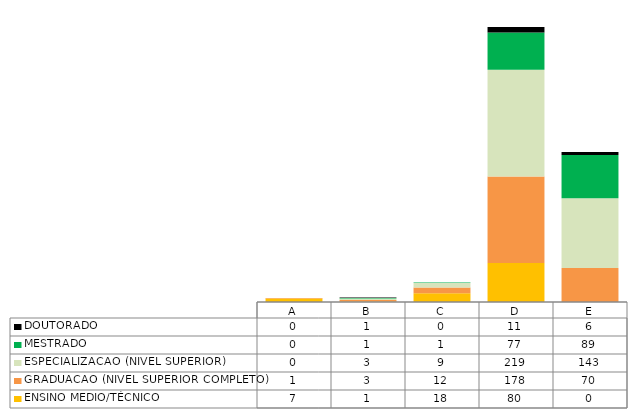
| Category | ENSINO MEDIO/TÉCNICO | GRADUACAO (NIVEL SUPERIOR COMPLETO) | ESPECIALIZACAO (NIVEL SUPERIOR)   | MESTRADO | DOUTORADO                             |
|---|---|---|---|---|---|
| A | 7 | 1 | 0 | 0 | 0 |
| B | 1 | 3 | 3 | 1 | 1 |
| C | 18 | 12 | 9 | 1 | 0 |
| D | 80 | 178 | 219 | 77 | 11 |
| E | 0 | 70 | 143 | 89 | 6 |